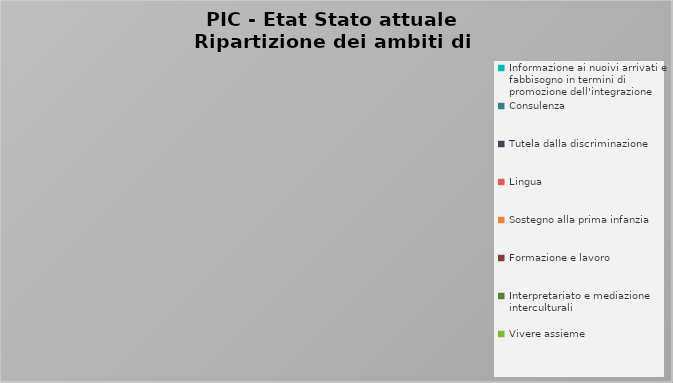
| Category | Totale |
|---|---|
| Informazione ai nuoivi arrivati e fabbisogno in termini di promozione dell'integrazione | 0 |
| Consulenza | 0 |
| Tutela dalla discriminazione | 0 |
| Lingua | 0 |
| Sostegno alla prima infanzia | 0 |
| Formazione e lavoro | 0 |
| Interpretariato e mediazione interculturali | 0 |
| Vivere assieme | 0 |